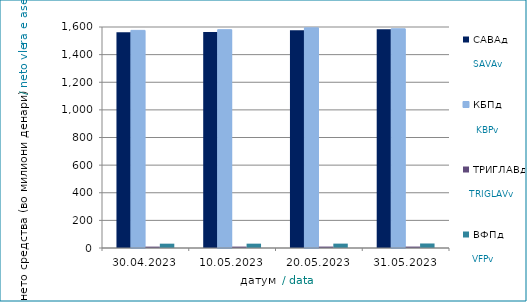
| Category | САВАд | КБПд | ТРИГЛАВд | ВФПд |
|---|---|---|---|---|
| 2023-04-30 | 1561.367 | 1575.502 | 10.052 | 31.357 |
| 2023-05-10 | 1563.261 | 1580.445 | 10.184 | 31.443 |
| 2023-05-20 | 1576.964 | 1593.717 | 10.323 | 31.736 |
| 2023-05-31 | 1584.341 | 1586.974 | 10.323 | 32.741 |